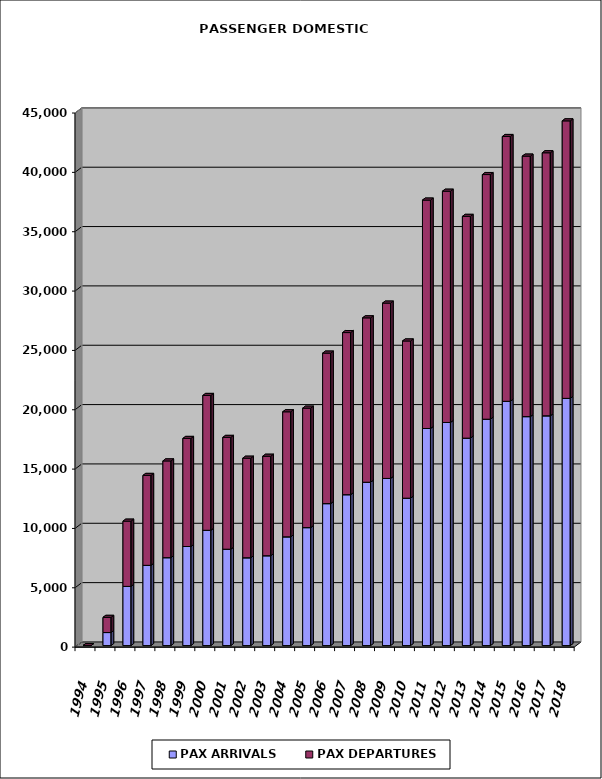
| Category | PAX ARRIVALS | PAX DEPARTURES |
|---|---|---|
| 1994.0 | 0 | 0 |
| 1995.0 | 1100 | 1279 |
| 1996.0 | 4988 | 5495 |
| 1997.0 | 6761 | 7576 |
| 1998.0 | 7408 | 8150 |
| 1999.0 | 8348 | 9105 |
| 2000.0 | 9716 | 11359 |
| 2001.0 | 8121 | 9419 |
| 2002.0 | 7400 | 8387 |
| 2003.0 | 7571 | 8381 |
| 2004.0 | 9164 | 10534 |
| 2005.0 | 9939 | 10065 |
| 2006.0 | 11961 | 12681 |
| 2007.0 | 12714 | 13658 |
| 2008.0 | 13764 | 13849 |
| 2009.0 | 14084 | 14771 |
| 2010.0 | 12419 | 13245 |
| 2011.0 | 18291 | 19243 |
| 2012.0 | 18799 | 19483 |
| 2013.0 | 17477 | 18685 |
| 2014.0 | 19074 | 20612 |
| 2015.0 | 20584 | 22308 |
| 2016.0 | 19292 | 21947 |
| 2017.0 | 19361 | 22160 |
| 2018.0 | 20829 | 23380 |